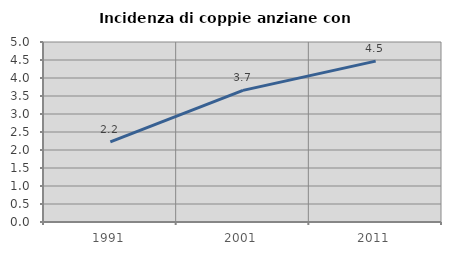
| Category | Incidenza di coppie anziane con figli |
|---|---|
| 1991.0 | 2.224 |
| 2001.0 | 3.656 |
| 2011.0 | 4.469 |